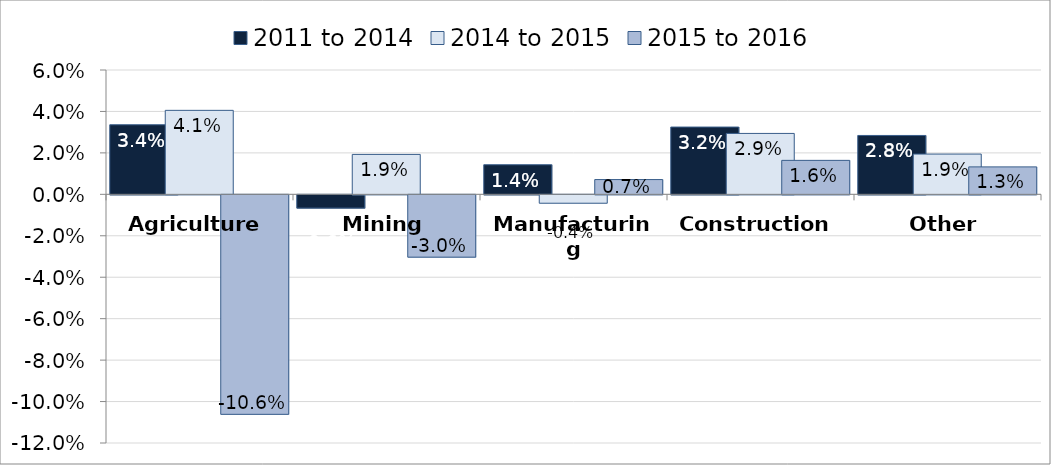
| Category | 2011 to 2014 | 2014 to 2015 | 2015 to 2016 |
|---|---|---|---|
| Agriculture | 0.034 | 0.041 | -0.106 |
| Mining | -0.006 | 0.019 | -0.03 |
| Manufacturing | 0.014 | -0.004 | 0.007 |
| Construction | 0.032 | 0.029 | 0.016 |
| Other | 0.028 | 0.019 | 0.013 |